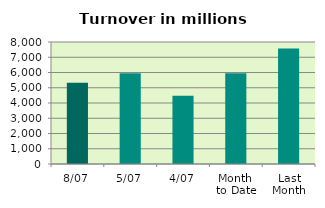
| Category | Series 0 |
|---|---|
| 8/07 | 5327.124 |
| 5/07 | 5950.736 |
| 4/07 | 4473.106 |
| Month 
to Date | 5951.474 |
| Last
Month | 7579.876 |